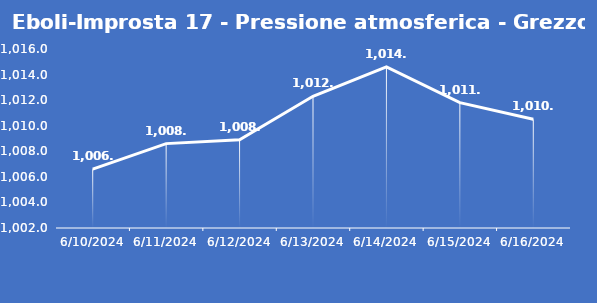
| Category | Eboli-Improsta 17 - Pressione atmosferica - Grezzo (hPa) |
|---|---|
| 6/10/24 | 1006.6 |
| 6/11/24 | 1008.6 |
| 6/12/24 | 1008.9 |
| 6/13/24 | 1012.3 |
| 6/14/24 | 1014.6 |
| 6/15/24 | 1011.8 |
| 6/16/24 | 1010.5 |